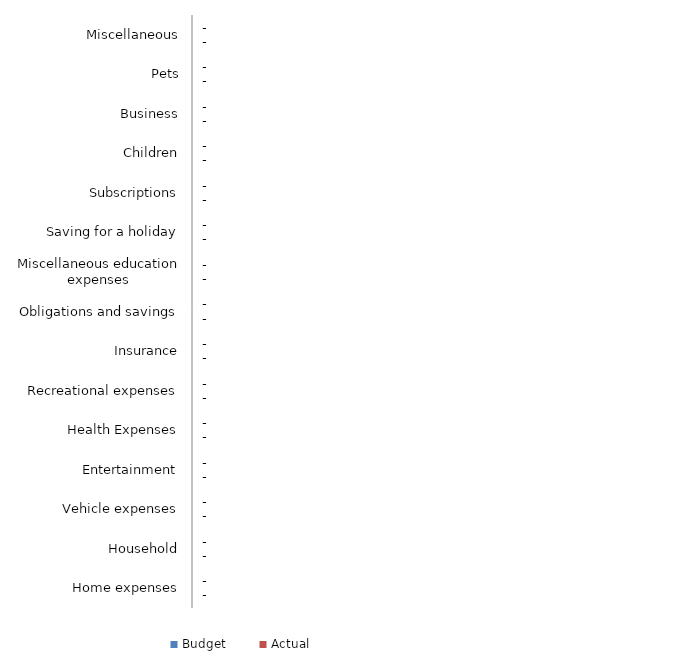
| Category | Budget | Actual |
|---|---|---|
| Home expenses | 0 | 0 |
| Household | 0 | 0 |
| Vehicle expenses | 0 | 0 |
| Entertainment | 0 | 0 |
| Health Expenses | 0 | 0 |
| Recreational expenses | 0 | 0 |
| Insurance | 0 | 0 |
| Obligations and savings | 0 | 0 |
| Miscellaneous education expenses | 0 | 0 |
| Saving for a holiday | 0 | 0 |
| Subscriptions | 0 | 0 |
| Children | 0 | 0 |
| Business | 0 | 0 |
| Pets | 0 | 0 |
| Miscellaneous | 0 | 0 |